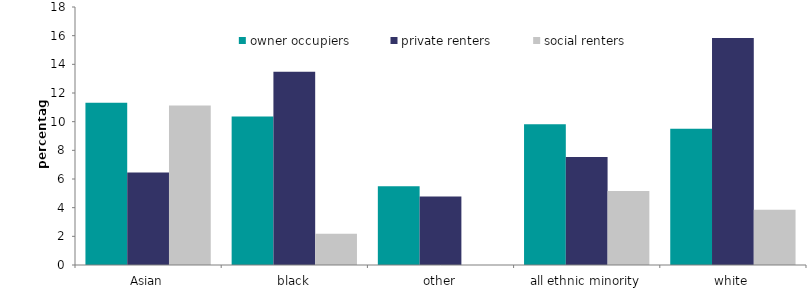
| Category | owner occupiers | private renters | social renters |
|---|---|---|---|
| Asian | 11.322 | 6.461 | 11.129 |
| black | 10.36 | 13.487 | 2.184 |
| other | 5.493 | 4.772 | 0 |
| all ethnic minority | 9.813 | 7.54 | 5.165 |
| white | 9.507 | 15.845 | 3.853 |